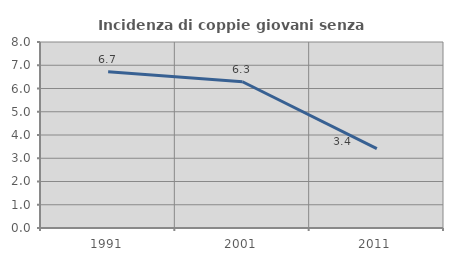
| Category | Incidenza di coppie giovani senza figli |
|---|---|
| 1991.0 | 6.719 |
| 2001.0 | 6.291 |
| 2011.0 | 3.416 |